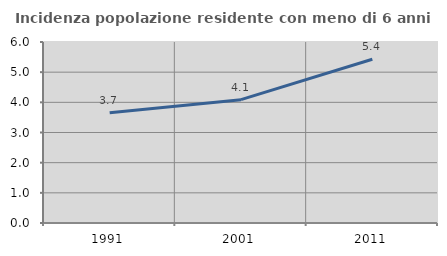
| Category | Incidenza popolazione residente con meno di 6 anni |
|---|---|
| 1991.0 | 3.659 |
| 2001.0 | 4.089 |
| 2011.0 | 5.426 |